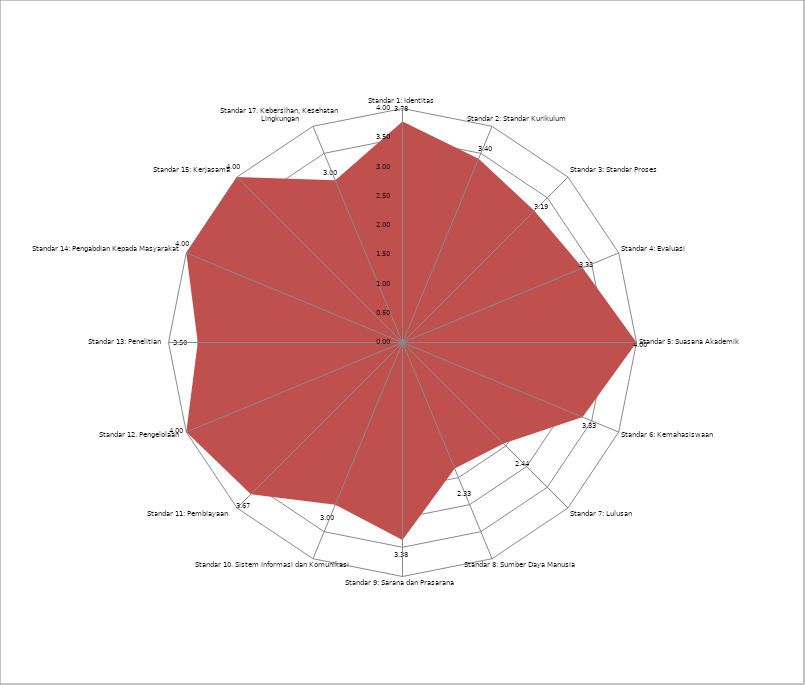
| Category | Series 0 |
|---|---|
| Standar 1: Identitas | 3.778 |
| Standar 2: Standar Kurikulum | 3.4 |
| Standar 3: Standar Proses | 3.188 |
| Standar 4: Evaluasi | 3.333 |
| Standar 5: Suasana Akademik | 4 |
| Standar 6: Kemahasiswaan | 3.333 |
| Standar 7: Lulusan  | 2.444 |
| Standar 8: Sumber Daya Manusia | 2.333 |
| Standar 9: Sarana dan Prasarana  | 3.375 |
| Standar 10. Sistem Informasi dan Komunikasi | 3 |
| Standar 11: Pembiayaan  | 3.667 |
| Standar 12. Pengelolaan | 4 |
| Standar 13: Penelitian | 3.5 |
| Standar 14: Pengabdian Kepada Masyarakat | 4 |
| Standar 15: Kerjasama  | 4 |
| Standar 17. Kebersihan, Kesehatan  Lingkungan | 3 |